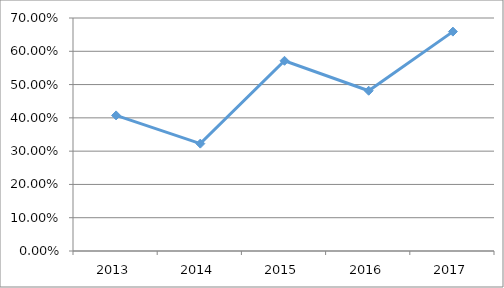
| Category | SIOP-I4O01 |
|---|---|
| 2013.0 | 0.407 |
| 2014.0 | 0.323 |
| 2015.0 | 0.571 |
| 2016.0 | 0.481 |
| 2017.0 | 0.659 |